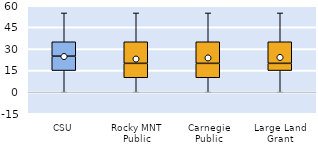
| Category | 25th | 50th | 75th |
|---|---|---|---|
| CSU | 15 | 10 | 10 |
| Rocky MNT Public | 10 | 10 | 15 |
| Carnegie Public | 10 | 10 | 15 |
| Large Land Grant | 15 | 5 | 15 |